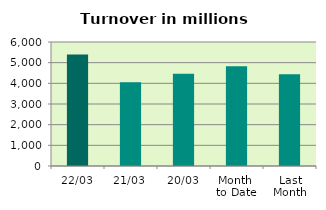
| Category | Series 0 |
|---|---|
| 22/03 | 5395.926 |
| 21/03 | 4057.709 |
| 20/03 | 4459.76 |
| Month 
to Date | 4823.468 |
| Last
Month | 4438.793 |